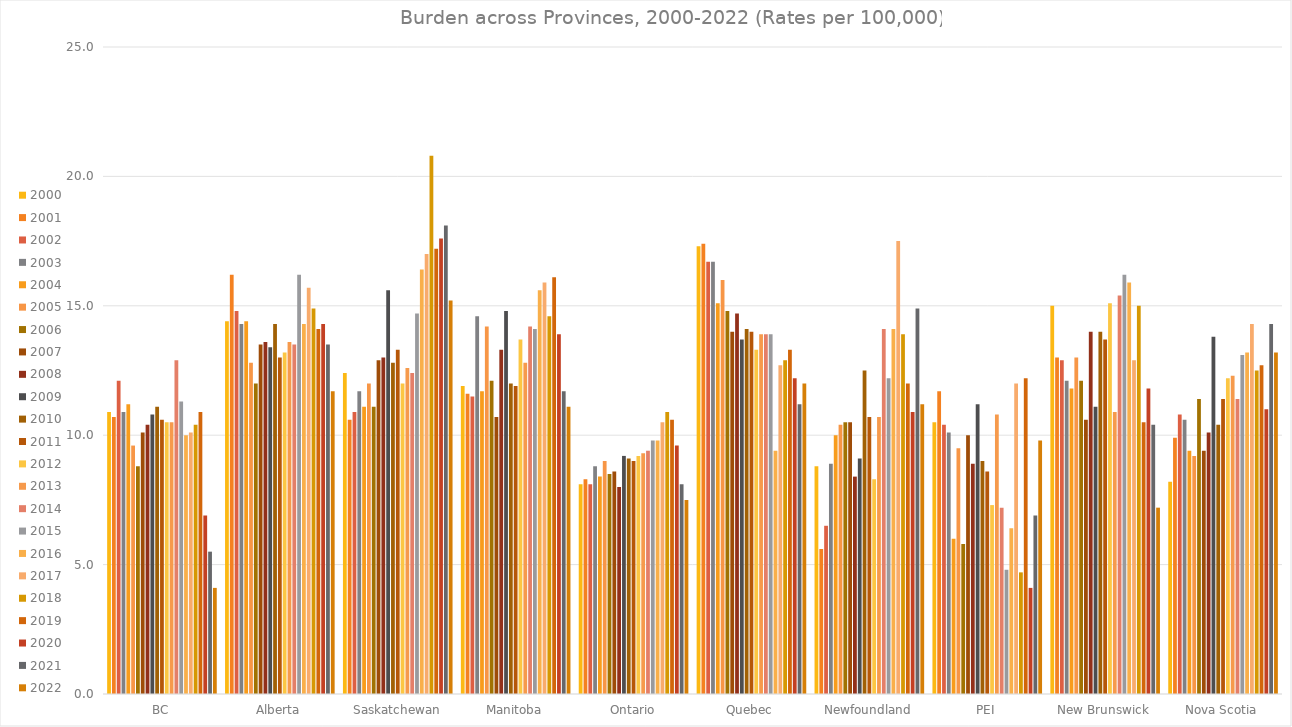
| Category | 2000 | 2001 | 2002 | 2003 | 2004 | 2005 | 2006 | 2007 | 2008 | 2009 | 2010 | 2011 | 2012 | 2013 | 2014 | 2015 | 2016 | 2017 | 2018 | 2019 | 2020 | 2021 | 2022 |
|---|---|---|---|---|---|---|---|---|---|---|---|---|---|---|---|---|---|---|---|---|---|---|---|
| BC | 10.9 | 10.7 | 12.1 | 10.9 | 11.2 | 9.6 | 8.8 | 10.1 | 10.4 | 10.8 | 11.1 | 10.6 | 10.5 | 10.5 | 12.9 | 11.3 | 10 | 10.1 | 10.4 | 10.9 | 6.9 | 5.5 | 4.1 |
| Alberta | 14.4 | 16.2 | 14.8 | 14.3 | 14.4 | 12.8 | 12 | 13.5 | 13.6 | 13.4 | 14.3 | 13 | 13.2 | 13.6 | 13.5 | 16.2 | 14.3 | 15.7 | 14.9 | 14.1 | 14.3 | 13.5 | 11.7 |
| Saskatchewan | 12.4 | 10.6 | 10.9 | 11.7 | 11.1 | 12 | 11.1 | 12.9 | 13 | 15.6 | 12.8 | 13.3 | 12 | 12.6 | 12.4 | 14.7 | 16.4 | 17 | 20.8 | 17.2 | 17.6 | 18.1 | 15.2 |
| Manitoba | 11.9 | 11.6 | 11.5 | 14.6 | 11.7 | 14.2 | 12.1 | 10.7 | 13.3 | 14.8 | 12 | 11.9 | 13.7 | 12.8 | 14.2 | 14.1 | 15.6 | 15.9 | 14.6 | 16.1 | 13.9 | 11.7 | 11.1 |
| Ontario | 8.1 | 8.3 | 8.1 | 8.8 | 8.4 | 9 | 8.5 | 8.6 | 8 | 9.2 | 9.1 | 9 | 9.2 | 9.3 | 9.4 | 9.8 | 9.8 | 10.5 | 10.9 | 10.6 | 9.6 | 8.1 | 7.5 |
| Quebec | 17.3 | 17.4 | 16.7 | 16.7 | 15.1 | 16 | 14.8 | 14 | 14.7 | 13.7 | 14.1 | 14 | 13.3 | 13.9 | 13.9 | 13.9 | 9.4 | 12.7 | 12.9 | 13.3 | 12.2 | 11.2 | 12 |
| Newfoundland | 8.8 | 5.6 | 6.5 | 8.9 | 10 | 10.4 | 10.5 | 10.5 | 8.4 | 9.1 | 12.5 | 10.7 | 8.3 | 10.7 | 14.1 | 12.2 | 14.1 | 17.5 | 13.9 | 12 | 10.9 | 14.9 | 11.2 |
| PEI | 10.5 | 11.7 | 10.4 | 10.1 | 6 | 9.5 | 5.8 | 10 | 8.9 | 11.2 | 9 | 8.6 | 7.3 | 10.8 | 7.2 | 4.8 | 6.4 | 12 | 4.7 | 12.2 | 4.1 | 6.9 | 9.8 |
| New Brunswick | 15 | 13 | 12.9 | 12.1 | 11.8 | 13 | 12.1 | 10.6 | 14 | 11.1 | 14 | 13.7 | 15.1 | 10.9 | 15.4 | 16.2 | 15.9 | 12.9 | 15 | 10.5 | 11.8 | 10.4 | 7.2 |
| Nova Scotia | 8.2 | 9.9 | 10.8 | 10.6 | 9.4 | 9.2 | 11.4 | 9.4 | 10.1 | 13.8 | 10.4 | 11.4 | 12.2 | 12.3 | 11.4 | 13.1 | 13.2 | 14.3 | 12.5 | 12.7 | 11 | 14.3 | 13.2 |